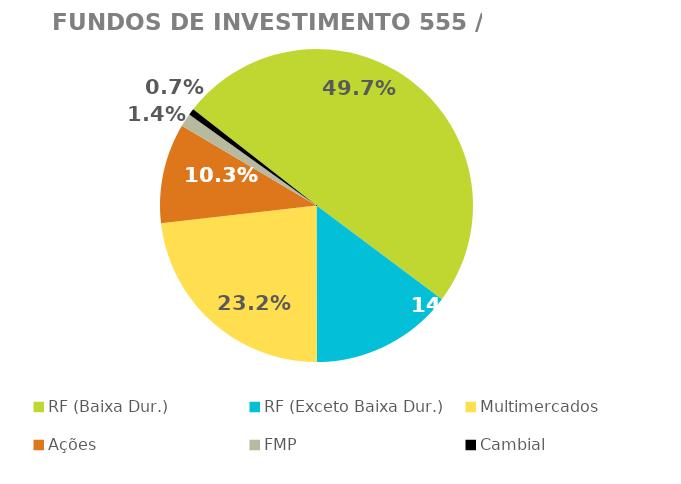
| Category | Fundos de Investimento 555 / FMP |
|---|---|
| RF (Baixa Dur.) | 0.497 |
| RF (Exceto Baixa Dur.) | 0.148 |
| Multimercados | 0.232 |
| Ações | 0.103 |
| FMP | 0.014 |
| Cambial | 0.007 |